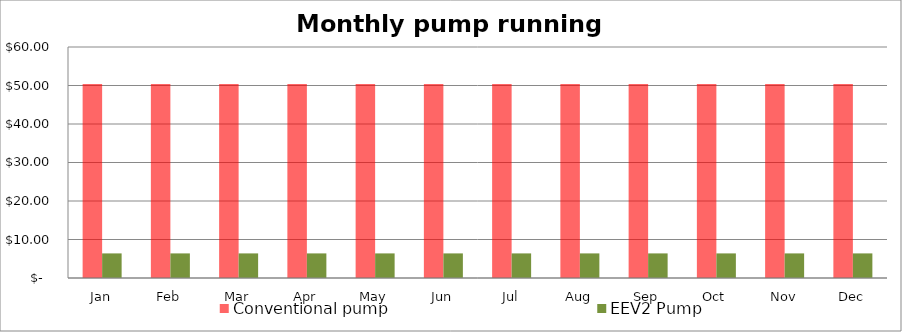
| Category | Conventional pump | EEV2 Pump |
|---|---|---|
| Jan | 50.4 | 6.389 |
| Feb | 50.4 | 6.389 |
| Mar | 50.4 | 6.389 |
| Apr | 50.4 | 6.389 |
| May | 50.4 | 6.389 |
| Jun | 50.4 | 6.389 |
| Jul | 50.4 | 6.389 |
| Aug | 50.4 | 6.389 |
| Sep | 50.4 | 6.389 |
| Oct | 50.4 | 6.389 |
| Nov | 50.4 | 6.389 |
| Dec | 50.4 | 6.389 |